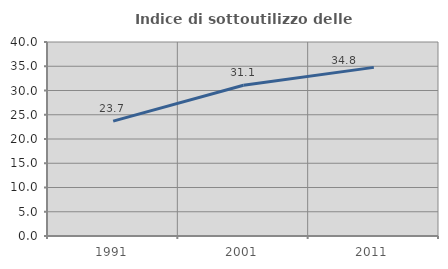
| Category | Indice di sottoutilizzo delle abitazioni  |
|---|---|
| 1991.0 | 23.688 |
| 2001.0 | 31.069 |
| 2011.0 | 34.77 |